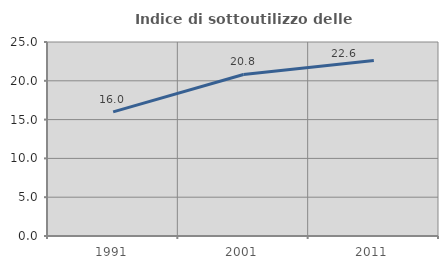
| Category | Indice di sottoutilizzo delle abitazioni  |
|---|---|
| 1991.0 | 15.991 |
| 2001.0 | 20.815 |
| 2011.0 | 22.607 |